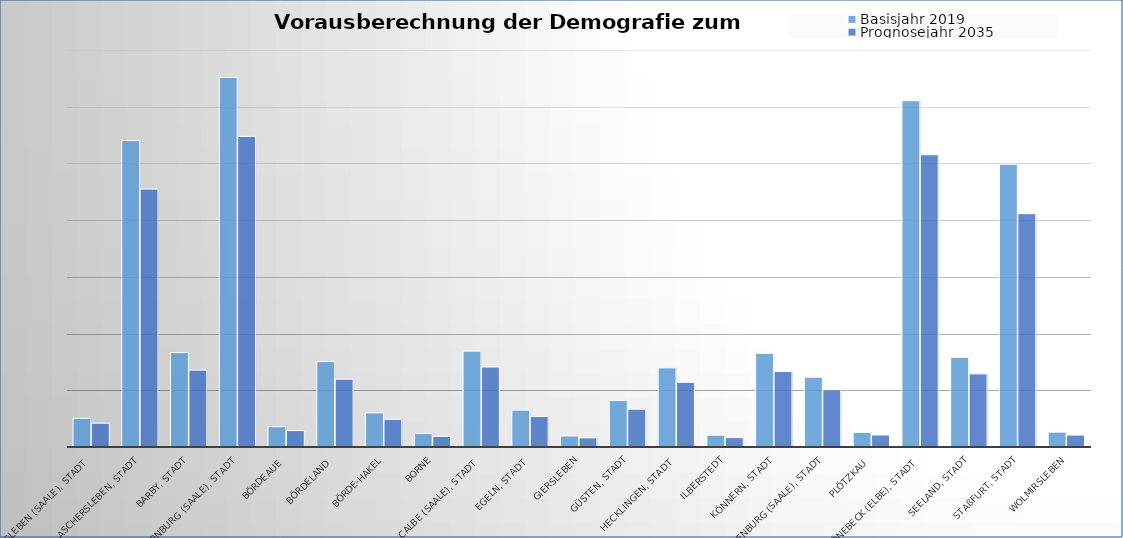
| Category | Basisjahr 2019 | Prognosejahr 2035 |
|---|---|---|
| Alsleben (Saale), Stadt | 2525 | 2099 |
| Aschersleben, Stadt | 27012 | 22738 |
| Barby, Stadt | 8323 | 6779 |
| Bernburg (Saale), Stadt | 32573 | 27381 |
| Bördeaue | 1790 | 1445 |
| Bördeland | 7535 | 5982 |
| Börde-Hakel | 3005 | 2437 |
| Borne | 1189 | 942 |
| Calbe (Saale), Stadt | 8450 | 7048 |
| Egeln, Stadt | 3254 | 2689 |
| Giersleben | 973 | 803 |
| Güsten, Stadt | 4093 | 3335 |
| Hecklingen, Stadt | 6981 | 5702 |
| Ilberstedt | 1042 | 827 |
| Könnern, Stadt | 8265 | 6656 |
| Nienburg (Saale), Stadt | 6158 | 5055 |
| Plötzkau | 1289 | 1058 |
| Schönebeck (Elbe), Stadt | 30532 | 25768 |
| Seeland, Stadt | 7903 | 6448 |
| Staßfurt, Stadt | 24923 | 20574 |
| Wolmirsleben | 1310 | 1054 |